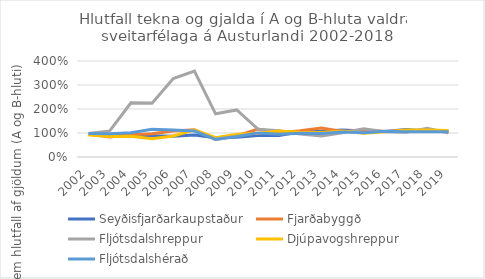
| Category | Seyðisfjarðarkaupstaður | Fjarðabyggð | Fljótsdalshreppur | Djúpavogshreppur | Fljótsdalshérað |
|---|---|---|---|---|---|
| 2002.0 | 0.953 | 0.962 | 0.984 | 0.918 | 0.975 |
| 2003.0 | 0.918 | 0.833 | 1.085 | 0.858 | 0.971 |
| 2004.0 | 0.884 | 0.924 | 2.26 | 0.867 | 1.013 |
| 2005.0 | 0.882 | 0.965 | 2.245 | 0.757 | 1.16 |
| 2006.0 | 0.863 | 1.082 | 3.27 | 0.875 | 1.12 |
| 2007.0 | 0.912 | 1.139 | 3.581 | 1.134 | 1.083 |
| 2008.0 | 0.806 | 0.728 | 1.8 | 0.803 | 0.735 |
| 2009.0 | 0.821 | 0.876 | 1.959 | 0.945 | 0.857 |
| 2010.0 | 0.898 | 1.168 | 1.162 | 0.985 | 1.005 |
| 2011.0 | 0.901 | 1.013 | 1.094 | 1.085 | 0.948 |
| 2012.0 | 1.052 | 1.09 | 0.953 | 1.029 | 0.991 |
| 2013.0 | 1.071 | 1.212 | 0.878 | 1.021 | 0.983 |
| 2014.0 | 1.127 | 1.068 | 1.012 | 1.085 | 1.039 |
| 2015.0 | 1.082 | 1.112 | 1.178 | 0.986 | 1.013 |
| 2016.0 | 1.063 | 1.066 | 1.053 | 1.052 | 1.069 |
| 2017.0 | 1.146 | 1.074 | 1.033 | 1.124 | 1.049 |
| 2018.0 | 1.084 | 1.1 | 1.2 | 1.122 | 1.049 |
| 2019.0 | 1.088 | 1.073 | 1.003 | 1.105 | 1.056 |